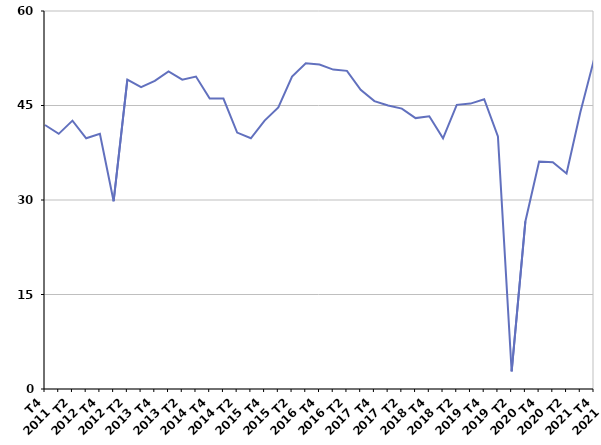
| Category | Radiation administrative |
|---|---|
| T4
2011 | 41.9 |
| T1
2012 | 40.5 |
| T2
2012 | 42.6 |
| T3
2012 | 39.8 |
| T4
2012 | 40.5 |
| T1
2013 | 29.8 |
| T2
2013 | 49.1 |
| T3
2013 | 47.9 |
| T4
2013 | 48.9 |
| T1
2014 | 50.4 |
| T2
2014 | 49.1 |
| T3
2014 | 49.6 |
| T4
2014 | 46.1 |
| T1
2015 | 46.1 |
| T2
2015 | 40.7 |
| T3
2015 | 39.8 |
| T4
2015 | 42.6 |
| T1
2016 | 44.7 |
| T2
2016 | 49.6 |
| T3
2016 | 51.7 |
| T4
2016 | 51.5 |
| T1
2017 | 50.7 |
| T2
2017 | 50.5 |
| T3
2017 | 47.5 |
| T4
2017 | 45.7 |
| T1
2018 | 45 |
| T2
2018 | 44.5 |
| T3
2018 | 43 |
| T4
2018 | 43.3 |
| T1
2019 | 39.8 |
| T2
2019 | 45.1 |
| T3
2019 | 45.3 |
| T4
2019 | 46 |
| T1
2020 | 40.1 |
| T2
2020 | 2.8 |
| T3
2020 | 26.6 |
| T4
2020 | 36.1 |
| T1
2021 | 36 |
| T2
2021 | 34.2 |
| T3
2021 | 43.9 |
| T4
2021 | 52.3 |